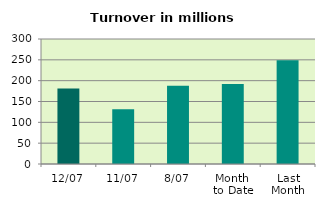
| Category | Series 0 |
|---|---|
| 12/07 | 181.045 |
| 11/07 | 131.43 |
| 8/07 | 188.05 |
| Month 
to Date | 191.982 |
| Last
Month | 248.976 |